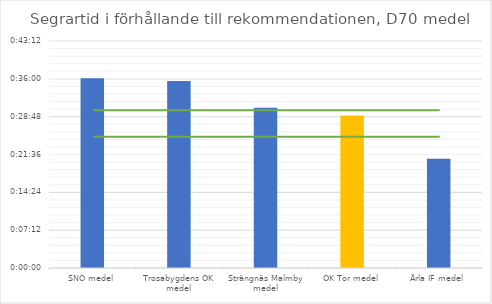
| Category | D70 tid |
|---|---|
| SNO medel | 0.025 |
| Trosabygdens OK medel | 0.025 |
| Strängnäs Malmby medel | 0.021 |
| OK Tor medel | 0.02 |
| Ärla IF medel | 0.014 |